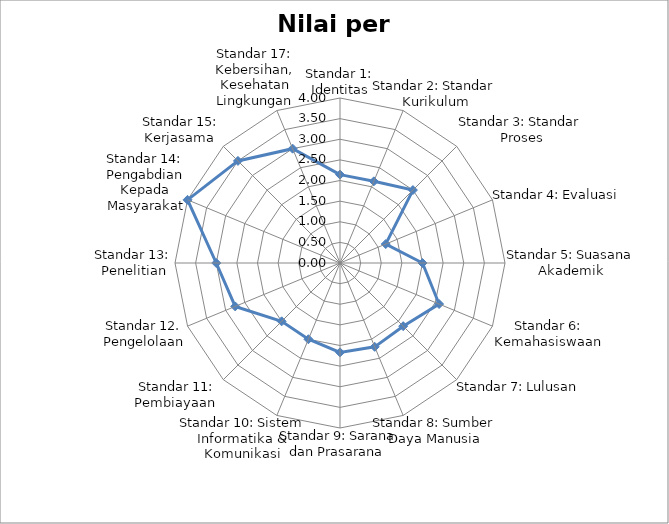
| Category | Nilai per standar |
|---|---|
| Standar 1: Identitas | 2.143 |
| Standar 2: Standar Kurikulum | 2.143 |
| Standar 3: Standar Proses | 2.5 |
| Standar 4: Evaluasi | 1.2 |
| Standar 5: Suasana Akademik | 2 |
| Standar 6: Kemahasiswaan | 2.6 |
| Standar 7: Lulusan  | 2.167 |
| Standar 8: Sumber Daya Manusia | 2.2 |
| Standar 9: Sarana dan Prasarana  | 2.167 |
| Standar 10: Sistem Informatika & Komunikasi | 2 |
| Standar 11: Pembiayaan  | 2 |
| Standar 12. Pengelolaan | 2.75 |
| Standar 13: Penelitian | 3 |
| Standar 14: Pengabdian Kepada Masyarakat | 4 |
| Standar 15: Kerjasama  | 3.5 |
| Standar 17: Kebersihan, Kesehatan Lingkungan | 3 |